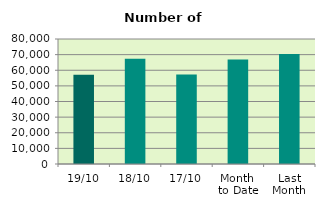
| Category | Series 0 |
|---|---|
| 19/10 | 57186 |
| 18/10 | 67346 |
| 17/10 | 57266 |
| Month 
to Date | 66916.923 |
| Last
Month | 70459.909 |